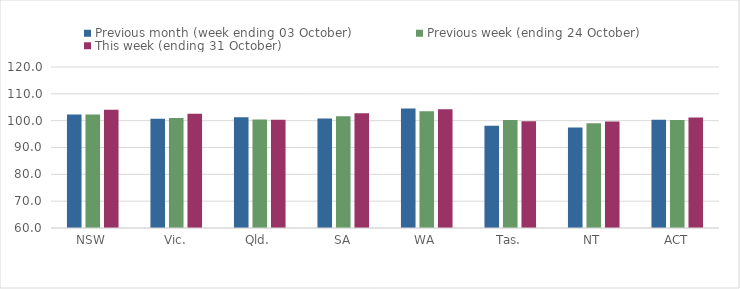
| Category | Previous month (week ending 03 October) | Previous week (ending 24 October) | This week (ending 31 October) |
|---|---|---|---|
| NSW | 102.27 | 102.28 | 104.05 |
| Vic. | 100.69 | 100.95 | 102.56 |
| Qld. | 101.29 | 100.43 | 100.36 |
| SA | 100.83 | 101.66 | 102.81 |
| WA | 104.54 | 103.47 | 104.22 |
| Tas. | 98.1 | 100.28 | 99.74 |
| NT | 97.41 | 99.03 | 99.69 |
| ACT | 100.36 | 100.21 | 101.21 |